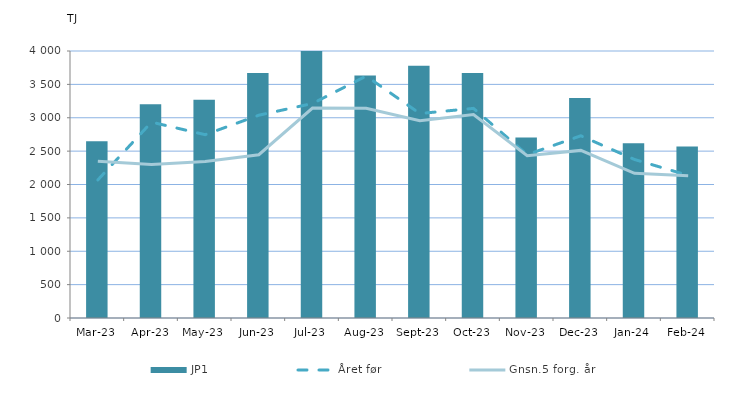
| Category | JP1 |
|---|---|
| 2023-03-01 | 2647.306 |
| 2023-04-01 | 3204.036 |
| 2023-05-01 | 3268.834 |
| 2023-06-01 | 3672.096 |
| 2023-07-01 | 4041.254 |
| 2023-08-01 | 3634.06 |
| 2023-09-01 | 3778.132 |
| 2023-10-01 | 3671.539 |
| 2023-11-01 | 2703.96 |
| 2023-12-01 | 3295.212 |
| 2024-01-01 | 2616.612 |
| 2024-02-01 | 2568.24 |